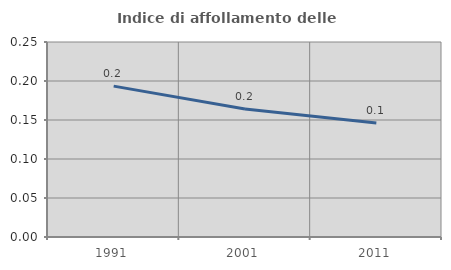
| Category | Indice di affollamento delle abitazioni  |
|---|---|
| 1991.0 | 0.193 |
| 2001.0 | 0.164 |
| 2011.0 | 0.146 |